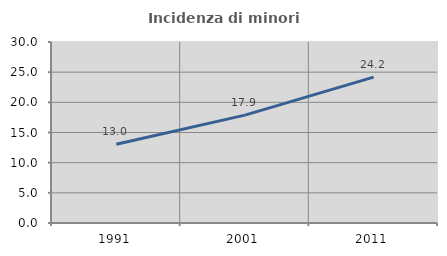
| Category | Incidenza di minori stranieri |
|---|---|
| 1991.0 | 13.043 |
| 2001.0 | 17.881 |
| 2011.0 | 24.178 |